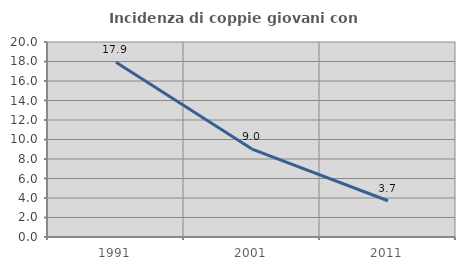
| Category | Incidenza di coppie giovani con figli |
|---|---|
| 1991.0 | 17.932 |
| 2001.0 | 9.019 |
| 2011.0 | 3.716 |